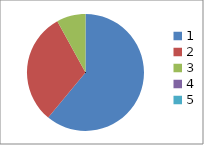
| Category | Series 0 |
|---|---|
| 0 | 0.61 |
| 1 | 0.31 |
| 2 | 0.08 |
| 3 | 0 |
| 4 | 0 |